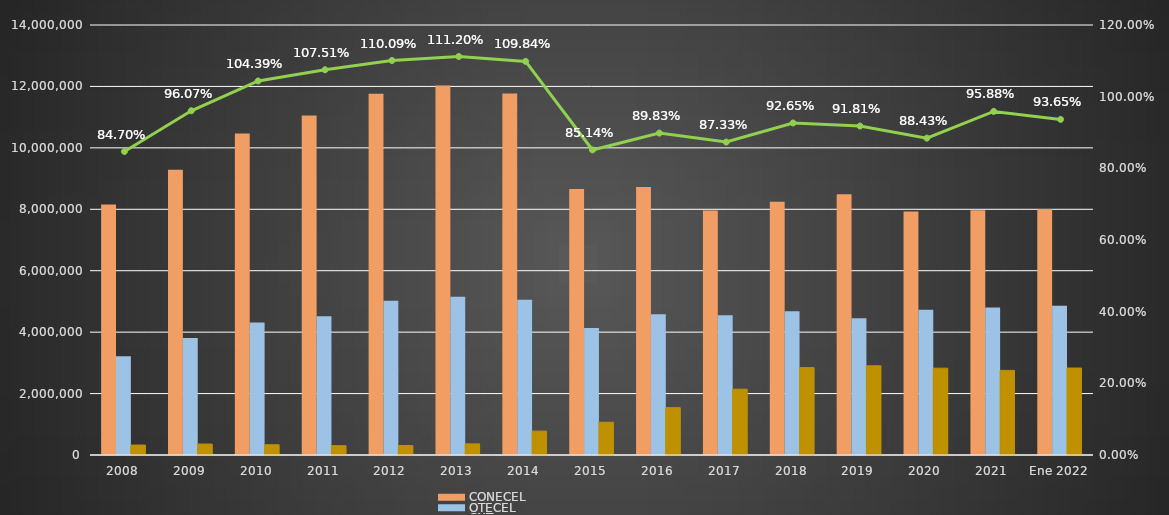
| Category | CONECEL | OTECEL | CNT |
|---|---|---|---|
| 2008 | 8156359 | 3211922 | 323967 |
| 2009 | 9291268 | 3806432 | 356900 |
| 2010 | 10470502 | 4314599 | 333730 |
| 2011 | 11057316 | 4513874 | 303368 |
| 2012 | 11757906 | 5019686 | 309271 |
| 2013 | 12030886 | 5148308 | 362560 |
| 2014 | 11772020 | 5055645 | 776892 |
| 2015 | 8658619 | 4134698 | 1065703 |
| 2016 | 8726823 | 4580092 | 1541219 |
| 2017 | 7960263 | 4549024 | 2142117 |
| 2018 | 8248050 | 4679646 | 2845142 |
| 2019 | 8493054 | 4456356 | 2903690 |
| 2020 | 7929253 | 4729725 | 2826388 |
| 2021 | 7965274 | 4800608 | 2755177 |
| Ene 2022 | 8012894 | 4856877 | 2831764 |